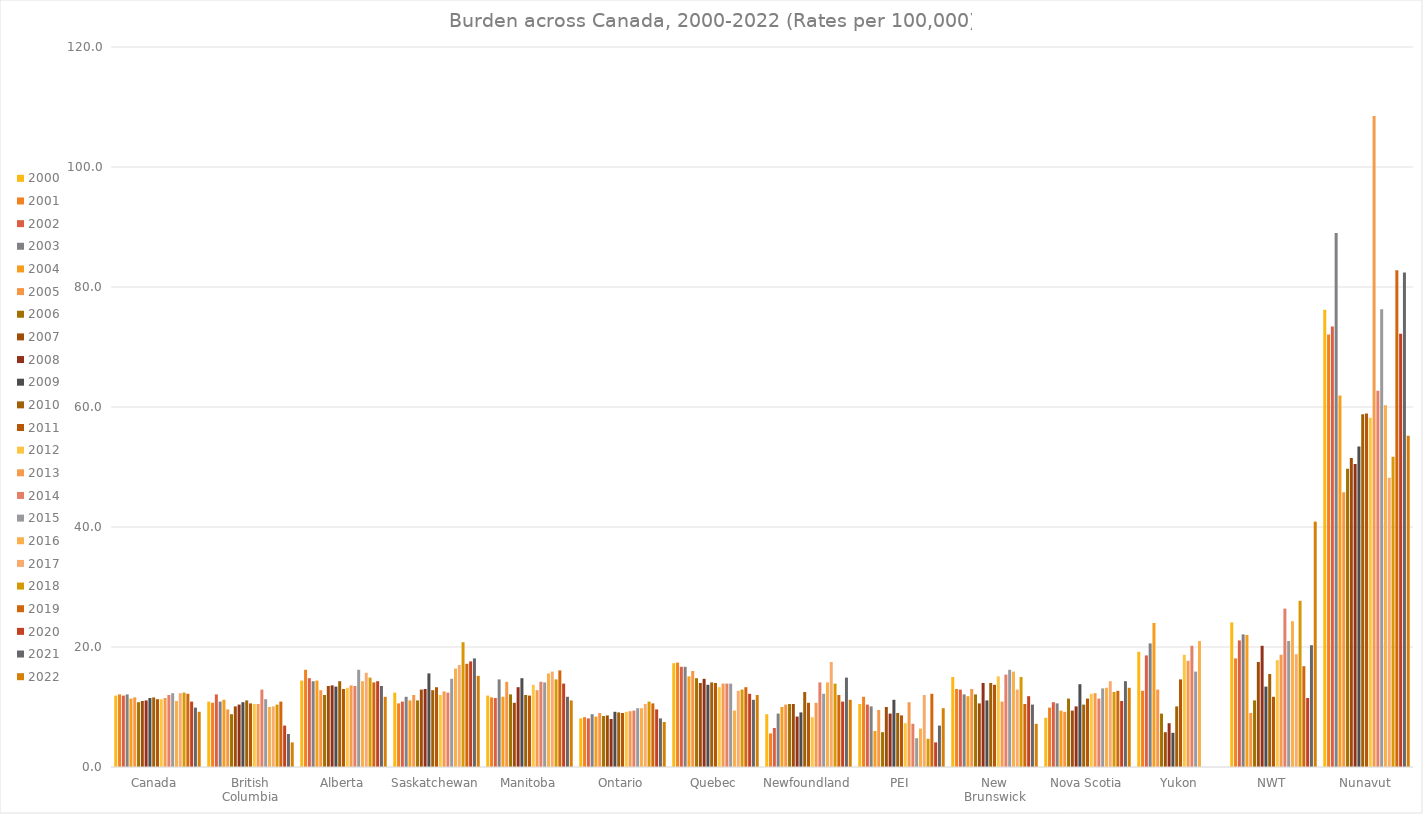
| Category | 2000 | 2001 | 2002 | 2003 | 2004 | 2005 | 2006 | 2007 | 2008 | 2009 | 2010 | 2011 | 2012 | 2013 | 2014 | 2015 | 2016 | 2017 | 2018 | 2019 | 2020 | 2021 | 2022 |
|---|---|---|---|---|---|---|---|---|---|---|---|---|---|---|---|---|---|---|---|---|---|---|---|
| Canada  | 11.9 | 12.1 | 11.9 | 12.1 | 11.4 | 11.6 | 10.8 | 11 | 11.1 | 11.5 | 11.6 | 11.3 | 11.3 | 11.5 | 12 | 12.3 | 11 | 12.3 | 12.4 | 12.2 | 10.9 | 9.9 | 9.2 |
| British Columbia | 10.9 | 10.7 | 12.1 | 10.9 | 11.2 | 9.6 | 8.8 | 10.1 | 10.4 | 10.8 | 11.1 | 10.6 | 10.5 | 10.5 | 12.9 | 11.3 | 10 | 10.1 | 10.4 | 10.9 | 6.9 | 5.5 | 4.1 |
| Alberta | 14.4 | 16.2 | 14.8 | 14.3 | 14.4 | 12.8 | 12 | 13.5 | 13.6 | 13.4 | 14.3 | 13 | 13.2 | 13.6 | 13.5 | 16.2 | 14.3 | 15.7 | 14.9 | 14.1 | 14.3 | 13.5 | 11.7 |
| Saskatchewan | 12.4 | 10.6 | 10.9 | 11.7 | 11.1 | 12 | 11.1 | 12.9 | 13 | 15.6 | 12.8 | 13.3 | 12 | 12.6 | 12.4 | 14.7 | 16.4 | 17 | 20.8 | 17.2 | 17.6 | 18.1 | 15.2 |
| Manitoba | 11.9 | 11.6 | 11.5 | 14.6 | 11.7 | 14.2 | 12.1 | 10.7 | 13.3 | 14.8 | 12 | 11.9 | 13.7 | 12.8 | 14.2 | 14.1 | 15.6 | 15.9 | 14.6 | 16.1 | 13.9 | 11.7 | 11.1 |
| Ontario | 8.1 | 8.3 | 8.1 | 8.8 | 8.4 | 9 | 8.5 | 8.6 | 8 | 9.2 | 9.1 | 9 | 9.2 | 9.3 | 9.4 | 9.8 | 9.8 | 10.5 | 10.9 | 10.6 | 9.6 | 8.1 | 7.5 |
| Quebec | 17.3 | 17.4 | 16.7 | 16.7 | 15.1 | 16 | 14.8 | 14 | 14.7 | 13.7 | 14.1 | 14 | 13.3 | 13.9 | 13.9 | 13.9 | 9.4 | 12.7 | 12.9 | 13.3 | 12.2 | 11.2 | 12 |
| Newfoundland | 8.8 | 5.6 | 6.5 | 8.9 | 10 | 10.4 | 10.5 | 10.5 | 8.4 | 9.1 | 12.5 | 10.7 | 8.3 | 10.7 | 14.1 | 12.2 | 14.1 | 17.5 | 13.9 | 12 | 10.9 | 14.9 | 11.2 |
| PEI | 10.5 | 11.7 | 10.4 | 10.1 | 6 | 9.5 | 5.8 | 10 | 8.9 | 11.2 | 9 | 8.6 | 7.3 | 10.8 | 7.2 | 4.8 | 6.4 | 12 | 4.7 | 12.2 | 4.1 | 6.9 | 9.8 |
| New Brunswick | 15 | 13 | 12.9 | 12.1 | 11.8 | 13 | 12.1 | 10.6 | 14 | 11.1 | 14 | 13.7 | 15.1 | 10.9 | 15.4 | 16.2 | 15.9 | 12.9 | 15 | 10.5 | 11.8 | 10.4 | 7.2 |
| Nova Scotia | 8.2 | 9.9 | 10.8 | 10.6 | 9.4 | 9.2 | 11.4 | 9.4 | 10.1 | 13.8 | 10.4 | 11.4 | 12.2 | 12.3 | 11.4 | 13.1 | 13.2 | 14.3 | 12.5 | 12.7 | 11 | 14.3 | 13.2 |
| Yukon | 19.2 | 12.7 | 18.6 | 20.6 | 24 | 12.9 | 8.9 | 5.8 | 7.3 | 5.7 | 10.1 | 14.6 | 18.7 | 17.7 | 20.2 | 15.9 | 21 | 0 | 0 | 0 | 0 | 0 | 0 |
| NWT | 24.1 | 18.1 | 21.1 | 22.1 | 22 | 9 | 11.1 | 17.5 | 20.2 | 13.4 | 15.5 | 11.7 | 17.8 | 18.7 | 26.4 | 21 | 24.3 | 18.8 | 27.7 | 16.8 | 11.5 | 20.3 | 40.9 |
| Nunavut | 76.2 | 72.1 | 73.4 | 89 | 61.9 | 45.8 | 49.7 | 51.5 | 50.5 | 53.4 | 58.8 | 58.9 | 58.2 | 108.5 | 62.7 | 76.3 | 60.3 | 48.2 | 51.7 | 82.8 | 72.2 | 82.4 | 55.2 |